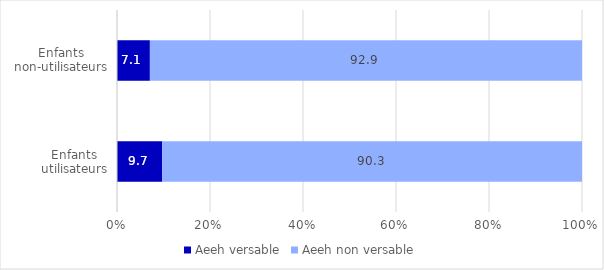
| Category | Aeeh versable | Aeeh non versable |
|---|---|---|
| Enfants utilisateurs | 9.736 | 90.264 |
| Enfants non-utilisateurs | 7.072 | 92.928 |